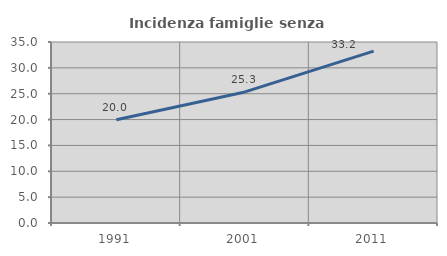
| Category | Incidenza famiglie senza nuclei |
|---|---|
| 1991.0 | 19.953 |
| 2001.0 | 25.347 |
| 2011.0 | 33.244 |